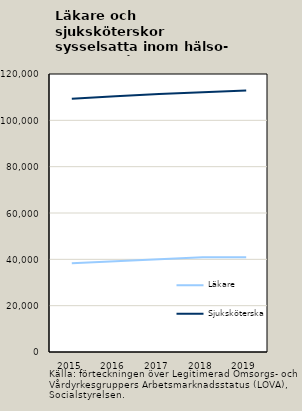
| Category | Läkare | Sjuksköterska |
|---|---|---|
| 2015.0 | 38297 | 109310 |
| 2016.0 | 39178 | 110343 |
| 2017.0 | 40004 | 111360 |
| 2018.0 | 40917 | 112164 |
| 2019.0 | 40868 | 112900 |